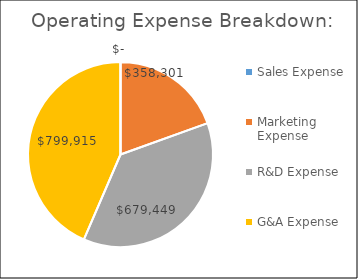
| Category | Series 0 |
|---|---|
| Sales Expense | 0 |
| Marketing Expense | 358300.644 |
| R&D Expense | 679448.75 |
| G&A Expense | 799915 |